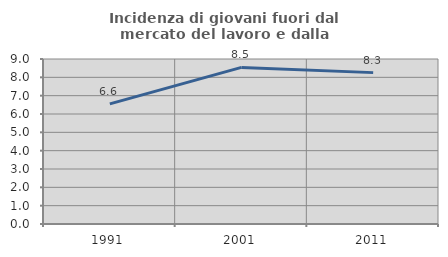
| Category | Incidenza di giovani fuori dal mercato del lavoro e dalla formazione  |
|---|---|
| 1991.0 | 6.552 |
| 2001.0 | 8.541 |
| 2011.0 | 8.257 |